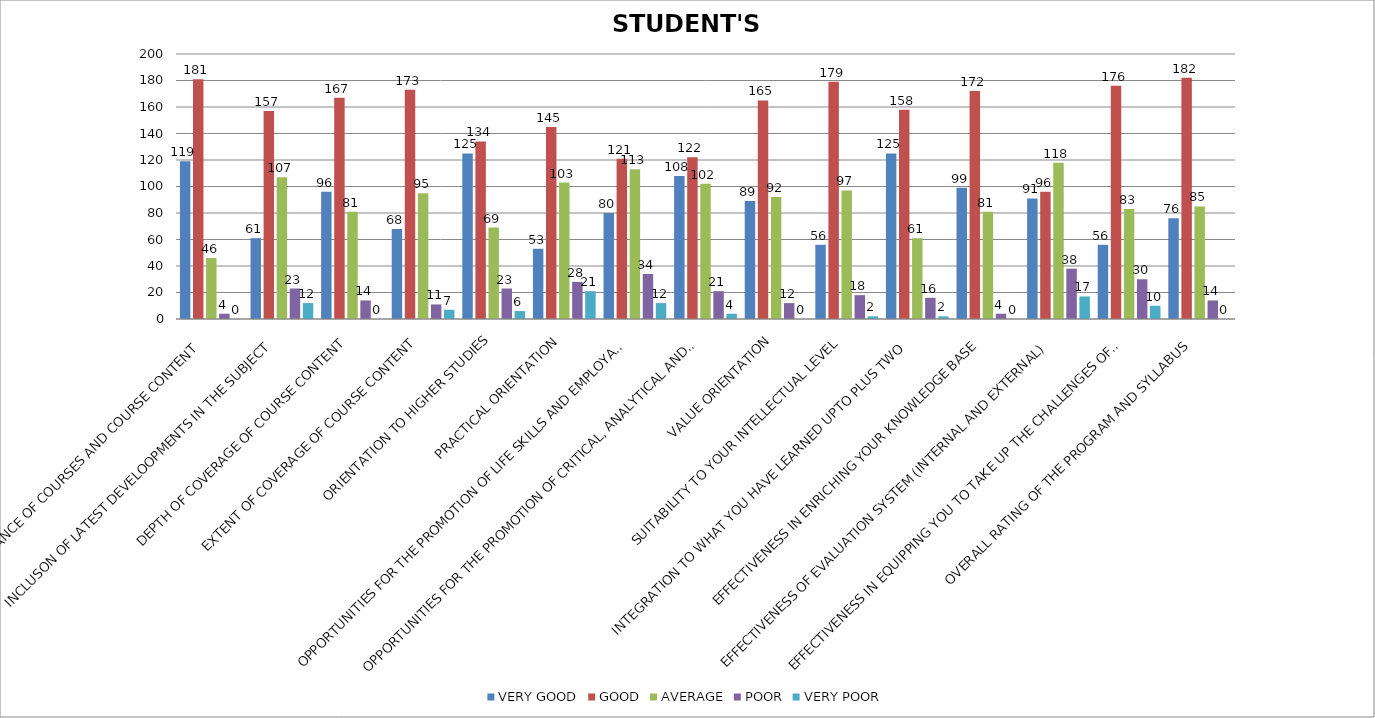
| Category | VERY GOOD | GOOD | AVERAGE | POOR | VERY POOR |
|---|---|---|---|---|---|
| CONTEMPORARY RELEVANCE OF COURSES AND COURSE CONTENT | 119 | 181 | 46 | 4 | 0 |
| INCLUSON OF LATEST DEVELOOPMENTS IN THE SUBJECT | 61 | 157 | 107 | 23 | 12 |
| DEPTH OF COVERAGE OF COURSE CONTENT | 96 | 167 | 81 | 14 | 0 |
| EXTENT OF COVERAGE OF COURSE CONTENT | 68 | 173 | 95 | 11 | 7 |
| ORIENTATION TO HIGHER STUDIES | 125 | 134 | 69 | 23 | 6 |
| PRACTICAL ORIENTATION | 53 | 145 | 103 | 28 | 21 |
| OPPORTUNITIES FOR THE PROMOTION OF LIFE SKILLS AND EMPLOYABILITY SKILLS | 80 | 121 | 113 | 34 | 12 |
| OPPORTUNITIES FOR THE PROMOTION OF CRITICAL, ANALYTICAL AND CREATIVE THINKING SKILLS | 108 | 122 | 102 | 21 | 4 |
| VALUE ORIENTATION | 89 | 165 | 92 | 12 | 0 |
| SUITABILITY TO YOUR INTELLECTUAL LEVEL | 56 | 179 | 97 | 18 | 2 |
| INTEGRATION TO WHAT YOU HAVE LEARNED UPTO PLUS TWO  | 125 | 158 | 61 | 16 | 2 |
| EFFECTIVENESS IN ENRICHING YOUR KNOWLEDGE BASE | 99 | 172 | 81 | 4 | 0 |
| EFFECTIVENESS OF EVALUATION SYSTEM (INTERNAL AND EXTERNAL) | 91 | 96 | 118 | 38 | 17 |
| EFFECTIVENESS IN EQUIPPING YOU TO TAKE UP THE CHALLENGES OF FUTUTRE | 56 | 176 | 83 | 30 | 10 |
| OVERALL RATING OF THE PROGRAM AND SYLLABUS | 76 | 182 | 85 | 14 | 0 |